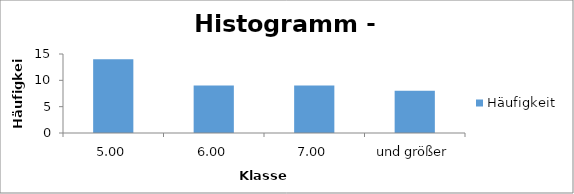
| Category | Häufigkeit |
|---|---|
| 5.00 | 14 |
| 6.00 | 9 |
| 7.00 | 9 |
| und größer | 8 |